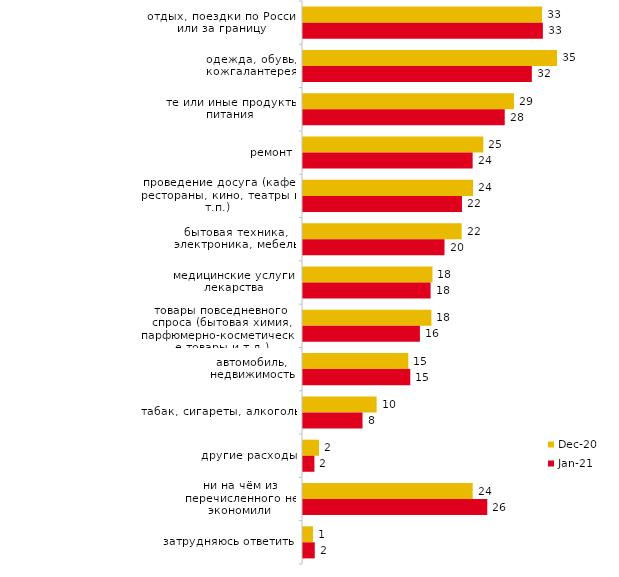
| Category | дек.20 | янв.21 |
|---|---|---|
| отдых, поездки по России или за границу | 33.317 | 33.433 |
| одежда, обувь, кожгалантерея | 35.399 | 31.893 |
| те или иные продукты питания | 29.4 | 28.117 |
| ремонт | 25.136 | 23.646 |
| проведение досуга (кафе, рестораны, кино, театры и т.п.) | 23.699 | 22.156 |
| бытовая техника, электроника, мебель | 22.112 | 19.722 |
| медицинские услуги, лекарства | 18.047 | 17.784 |
| товары повседневного спроса (бытовая химия, парфюмерно-косметические товары и т.д.) | 17.898 | 16.294 |
| автомобиль, недвижимость | 14.675 | 14.953 |
| табак, сигареты, алкоголь | 10.263 | 8.296 |
| другие расходы | 2.231 | 1.59 |
| ни на чём из перечисленного не экономили | 23.649 | 25.683 |
| затрудняюсь ответить | 1.388 | 1.639 |